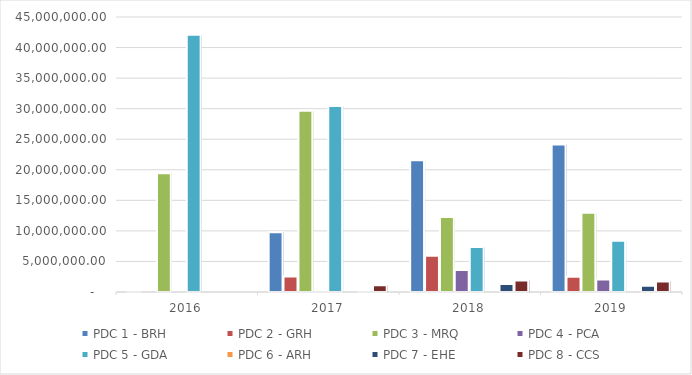
| Category | PDC 1 - BRH | PDC 2 - GRH | PDC 3 - MRQ | PDC 4 - PCA | PDC 5 - GDA | PDC 6 - ARH | PDC 7 - EHE | PDC 8 - CCS |
|---|---|---|---|---|---|---|---|---|
| 2016.0 | 252510.72 | 0 | 19439967.19 | 0 | 42097124.15 | 0 | 0 | 0 |
| 2017.0 | 9786749.51 | 2538598.14 | 29673344.2 | 26283.48 | 30454623.82 | 0 | 225527.57 | 1122342.58 |
| 2018.0 | 21554802.7 | 5925000 | 12272815.88 | 3600000 | 7366148.47 | 0 | 1299472.43 | 1895000 |
| 2019.0 | 24131963.97 | 2494089.3 | 12961892.57 | 2050000 | 8378425.16 | 0 | 1025000 | 1731000 |